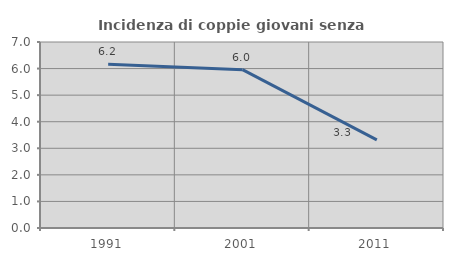
| Category | Incidenza di coppie giovani senza figli |
|---|---|
| 1991.0 | 6.16 |
| 2001.0 | 5.959 |
| 2011.0 | 3.315 |